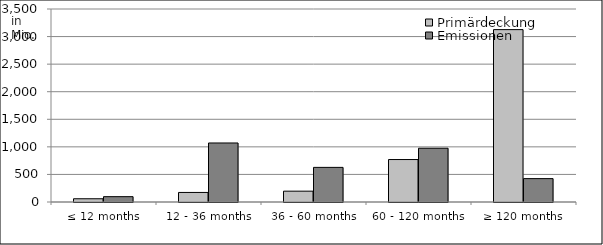
| Category | Primärdeckung | Emissionen |
|---|---|---|
| ≤ 12 months | 58780076.35 | 96840789.23 |
| 12 - 36 months | 173378385.923 | 1070500000 |
| 36 - 60 months | 196622710.46 | 627650000 |
| 60 - 120 months | 769877753.12 | 975000000 |
| ≥ 120 months | 3126216749.128 | 424038400.38 |